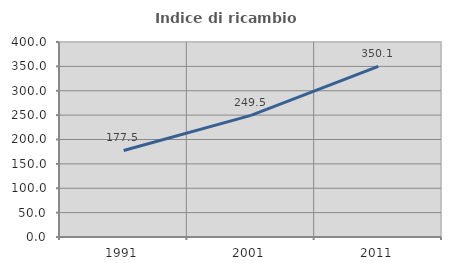
| Category | Indice di ricambio occupazionale  |
|---|---|
| 1991.0 | 177.525 |
| 2001.0 | 249.499 |
| 2011.0 | 350.098 |